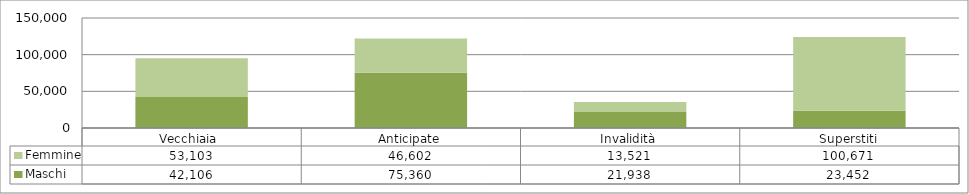
| Category | Maschi | Femmine |
|---|---|---|
| Vecchiaia  | 42106 | 53103 |
| Anticipate | 75360 | 46602 |
| Invalidità | 21938 | 13521 |
| Superstiti | 23452 | 100671 |